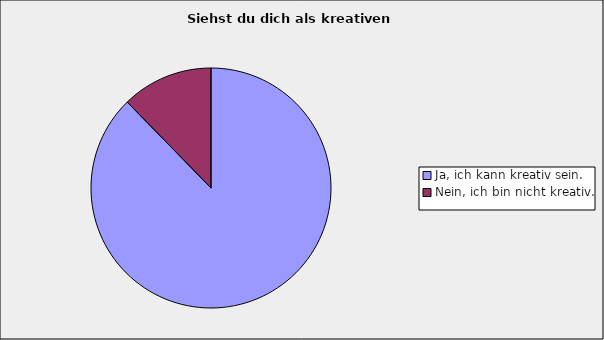
| Category | Series 0 |
|---|---|
| Ja, ich kann kreativ sein. | 0.877 |
| Nein, ich bin nicht kreativ. | 0.123 |